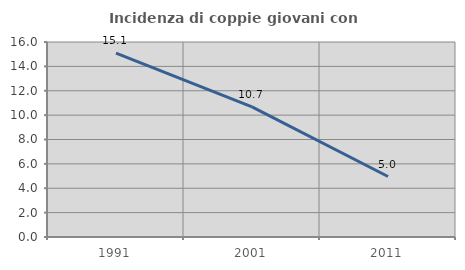
| Category | Incidenza di coppie giovani con figli |
|---|---|
| 1991.0 | 15.089 |
| 2001.0 | 10.678 |
| 2011.0 | 4.963 |